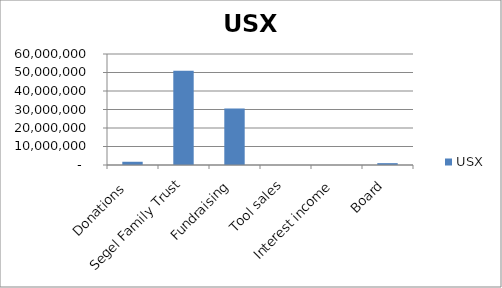
| Category | USX |
|---|---|
| Donations  | 1750000 |
| Segel Family Trust | 51000000 |
| Fundraising | 30500000 |
| Tool sales | 0 |
| Interest income | 10000 |
| Board | 1000000 |